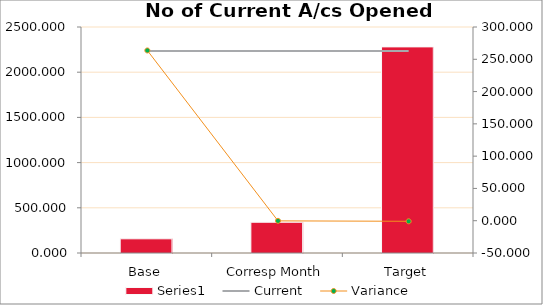
| Category | Series 0 |
|---|---|
| Base | 157 |
| Corresp Month | 340 |
| Target | 2280 |